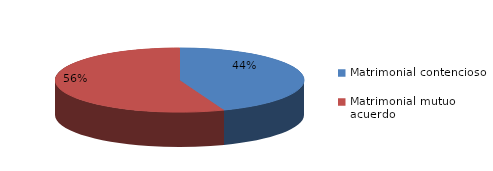
| Category | Series 0 |
|---|---|
| 0 | 350 |
| 1 | 442 |